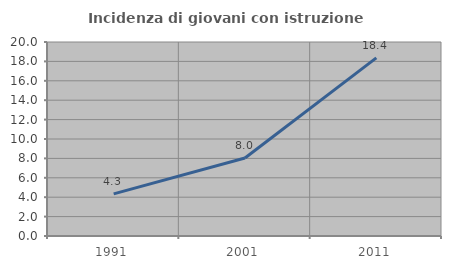
| Category | Incidenza di giovani con istruzione universitaria |
|---|---|
| 1991.0 | 4.348 |
| 2001.0 | 8.042 |
| 2011.0 | 18.367 |